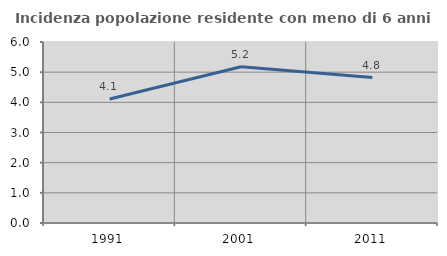
| Category | Incidenza popolazione residente con meno di 6 anni |
|---|---|
| 1991.0 | 4.11 |
| 2001.0 | 5.179 |
| 2011.0 | 4.82 |